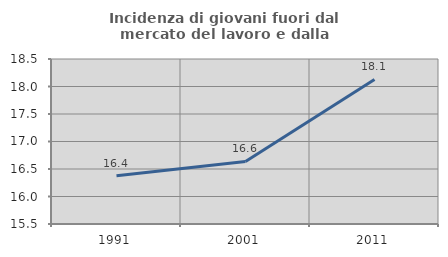
| Category | Incidenza di giovani fuori dal mercato del lavoro e dalla formazione  |
|---|---|
| 1991.0 | 16.379 |
| 2001.0 | 16.637 |
| 2011.0 | 18.127 |